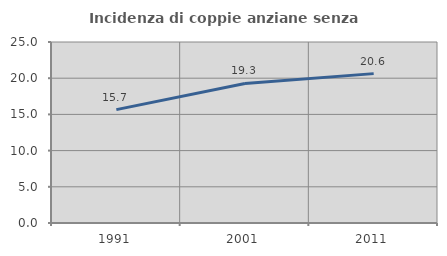
| Category | Incidenza di coppie anziane senza figli  |
|---|---|
| 1991.0 | 15.659 |
| 2001.0 | 19.275 |
| 2011.0 | 20.632 |